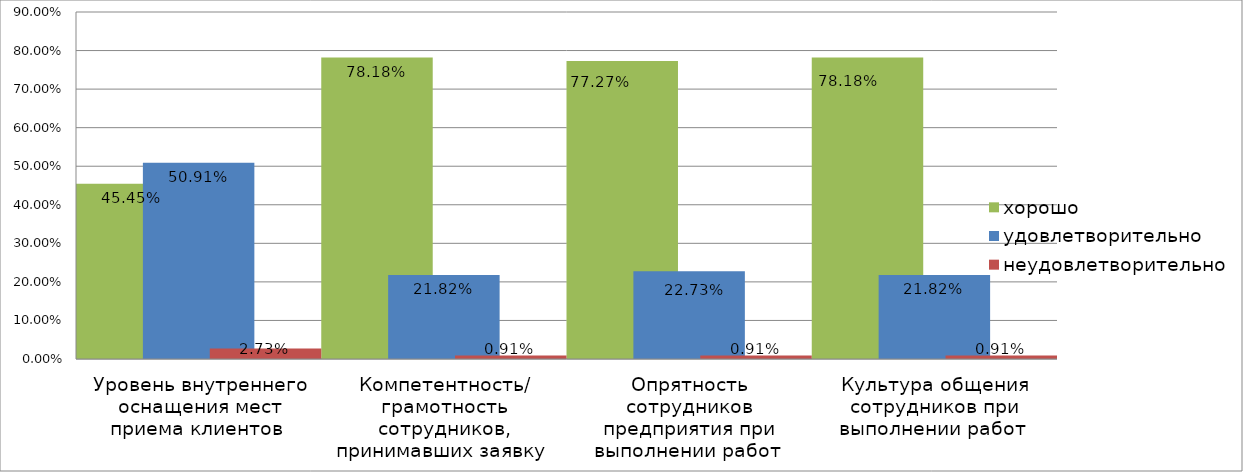
| Category | хорошо | удовлетворительно | неудовлетворительно |
|---|---|---|---|
| Уровень внутреннего оснащения мест приема клиентов  | 0.455 | 0.509 | 0.027 |
| Компетентность/ грамотность сотрудников, принимавших заявку  | 0.782 | 0.218 | 0.009 |
| Опрятность сотрудников предприятия при выполнении работ  | 0.773 | 0.227 | 0.009 |
| Культура общения сотрудников при выполнении работ  | 0.782 | 0.218 | 0.009 |